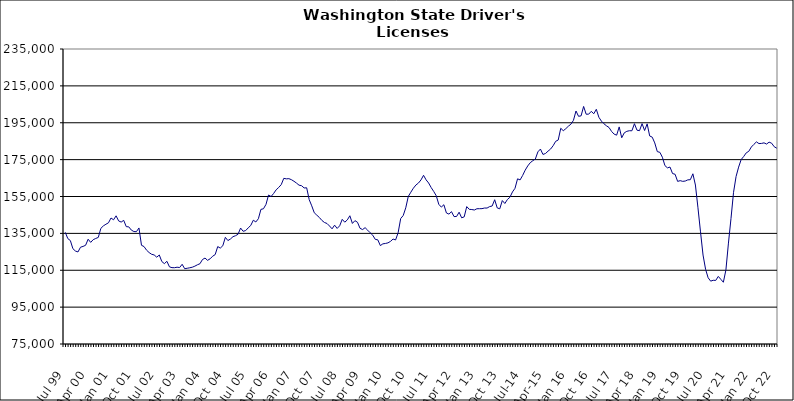
| Category | Series 0 |
|---|---|
| Jul 99 | 135560 |
| Aug 99 | 132182 |
| Sep 99 | 131104 |
| Oct 99 | 126694 |
| Nov 99 | 125425 |
| Dec 99 | 124927 |
| Jan 00 | 127499 |
| Feb 00 | 127927 |
| Mar 00 | 128547 |
| Apr 00 | 131834 |
| May 00 | 130120 |
| Jun 00 | 131595 |
| Jul 00 | 132236 |
| Aug 00 | 132819 |
| Sep 00 | 137711 |
| Oct 00 | 139063 |
| Nov 00 | 139952 |
| Dec 00 | 140732 |
| Jan 01 | 143338 |
| Feb 01 | 142359 |
| Mar 01 | 144523 |
| Apr 01 | 141758 |
| May 01 | 141135 |
| Jun 01 | 142064 |
| Jul 01 | 138646 |
| Aug 01 | 138530 |
| Sep 01 | 136784 |
| Oct 01 | 135996 |
| Nov 01 | 135917 |
| Dec 01 | 137940 |
| Jan 02 | 128531 |
| Feb 02 | 127848 |
| Mar 02 | 125876 |
| Apr 02 | 124595 |
| May 02 | 123660 |
| Jun 02 | 123282 |
| Jul 02 | 122089 |
| Aug 02 | 123279 |
| Sep 02 | 119727 |
| Oct 02 | 118588 |
| Nov 02 | 119854 |
| Dec 02 | 116851 |
| Jan 03 | 116407 |
| Feb 03 | 116382 |
| Mar 03 | 116648 |
| Apr 03 | 116471 |
| May 03 | 118231 |
| Jun 03 | 115831 |
| Jul 03 | 116082 |
| Aug 03 | 116341 |
| Sep 03 | 116653 |
| Oct 03 | 117212 |
| Nov 03 | 117962 |
| Dec 03 | 118542 |
| Jan 04 | 120817 |
| Feb 04 | 121617 |
| Mar 04 | 120369 |
| Apr 04 | 121200 |
| May 04 | 122609 |
| Jun 04 | 123484 |
| Jul 04 | 127844 |
| Aug 04 | 127025 |
| Sep 04 | 128273 |
| Oct 04 | 132853 |
| Nov 04 | 131106 |
| Dec 04 | 131935 |
| Jan 05 | 133205 |
| Feb 05 | 133736 |
| Mar 05 | 134528 |
| Apr 05 | 137889 |
| May 05 | 136130 |
| Jun 05 | 136523 |
| Jul 05 | 137997 |
| Aug 05 | 139294 |
| Sep 05 | 142140 |
| Oct 05 | 141192 |
| Nov 05 | 142937 |
| Dec 05 | 148013 |
| Jan 06 | 148341 |
| Feb 06 | 150744 |
| Mar 06 | 155794 |
| Apr 06 | 154984 |
| May 06 | 156651 |
| Jun 06 | 158638 |
| Jul 06 | 159911 |
| Aug 06 | 161445 |
| Sep 06 | 164852 |
| Oct 06 | 164570 |
| Nov 06 | 164679 |
| Dec 06 | 164127 |
| Jan 07 | 163271 |
| Feb 07 | 162273 |
| Mar 07 | 161140 |
| Apr 07 | 160860 |
| May 07 | 159633 |
| Jun 07 | 159724 |
| Jul 07 | 153303 |
| Aug 07 | 149939 |
| Sep 07 | 146172 |
| Oct 07 | 144876 |
| Nov 07 | 143613 |
| Dec 07 | 142022 |
| Jan 08 | 140909 |
| Feb 08 | 140368 |
| Mar 08 | 138998 |
| Apr 08 | 137471 |
| May 08 | 139453 |
| Jun 08 | 137680 |
| Jul 08 | 139120 |
| Aug 08 | 142612 |
| Sep-08 | 141071 |
| Oct 08 | 142313 |
| Nov 08 | 144556 |
| Dec 08 | 140394 |
| Jan 09 | 141903 |
| Feb 09 | 141036 |
| Mar 09 | 137751 |
| Apr 09 | 137060 |
| May 09 | 138101 |
| Jun 09 | 136739 |
| Jul 09 | 135317 |
| Aug 09 | 134020 |
| Sep 09 | 131756 |
| Oct 09 | 131488 |
| Nov 09 | 128370 |
| Dec 09 | 129323 |
| Jan 10 | 129531 |
| Feb 10 | 129848 |
| Mar 10 | 130654 |
| Apr 10 | 131929 |
| May 10 | 131429 |
| Jun 10 | 135357 |
| Jul 10 | 143032 |
| Aug 10 | 144686 |
| Sep 10 | 148856 |
| Oct 10 | 155042 |
| Nov 10 | 157328 |
| Dec 10 | 159501 |
| Jan 11 | 161221 |
| Feb 11 | 162312 |
| Mar 11 | 163996 |
| Apr 11 | 166495 |
| May 11 | 164040 |
| Jun 11 | 162324 |
| Jul 11 | 159862 |
| Aug 11 | 157738 |
| Sep 11 | 155430 |
| Oct 11 | 150762 |
| Nov 11 | 149255 |
| Dec 11 | 150533 |
| Jan 12 | 146068 |
| Feb 12 | 145446 |
| Mar 12 | 146788 |
| Apr 12 | 144110 |
| May 12 | 144162 |
| Jun 12 | 146482 |
| Jul 12 | 143445 |
| Aug 12 | 143950 |
| Sep 12 | 149520 |
| Oct 12 | 148033 |
| Nov 12 | 147926 |
| Dec 12 | 147674 |
| Jan 13 | 148360 |
| Feb-13 | 148388 |
| Mar-13 | 148414 |
| Apr 13 | 148749 |
| May 13 | 148735 |
| Jun-13 | 149521 |
| Jul 13 | 149837 |
| Aug 13 | 153252 |
| Sep 13 | 148803 |
| Oct 13 | 148315 |
| Nov 13 | 152804 |
| Dec 13 | 151209 |
| Jan 14 | 153357 |
| Feb-14 | 154608 |
| Mar 14 | 157479 |
| Apr 14 | 159441 |
| May 14 | 164591 |
| Jun 14 | 163995 |
| Jul-14 | 166411 |
| Aug-14 | 169272 |
| Sep 14 | 171565 |
| Oct 14 | 173335 |
| Nov 14 | 174406 |
| Dec 14 | 175302 |
| Jan 15 | 179204 |
| Feb 15 | 180737 |
| Mar 15 | 177810 |
| Apr-15 | 178331 |
| May 15 | 179601 |
| Jun-15 | 180729 |
| Jul 15 | 182540 |
| Aug 15 | 184924 |
| Sep 15 | 185620 |
| Oct 15 | 192002 |
| Nov 15 | 190681 |
| Dec 15 | 191795 |
| Jan 16 | 193132 |
| Feb 16 | 194206 |
| Mar 16 | 196319 |
| Apr 16 | 201373 |
| May 16 | 198500 |
| Jun 16 | 198743 |
| Jul 16 | 203841 |
| Aug 16 | 199630 |
| Sep 16 | 199655 |
| Oct 16 | 201181 |
| Nov 16 | 199888 |
| Dec 16 | 202304 |
| Jan 17 | 197977 |
| Feb 17 | 195889 |
| Mar 17 | 194438 |
| Apr 17 | 193335 |
| May 17 | 192430 |
| Jun 17 | 190298 |
| Jul 17 | 188832 |
| Aug 17 | 188264 |
| Sep 17 | 192738 |
| Oct 17 | 186856 |
| Nov 17 | 189537 |
| Dec 17 | 190341 |
| Jan 18 | 190670 |
| Feb 18 | 190645 |
| Mar 18 | 194476 |
| Apr 18 | 190971 |
| May 18 | 190707 |
| Jun 18 | 194516 |
| Jul 18 | 190783 |
| Aug 18 | 194390 |
| Sep 18 | 187831 |
| Oct 18 | 187188 |
| Nov 18 | 184054 |
| Dec 18 | 179347 |
| Jan 19 | 178958 |
| Feb 19 | 176289 |
| Mar 19 | 171747 |
| Apr 19 | 170532 |
| May 19 | 170967 |
| Jun 19 | 167444 |
| Jul 19 | 167059 |
| Aug 19 | 163194 |
| Sep 19 | 163599 |
| Oct 19 | 163212 |
| Nov 19 | 163388 |
| Dec 19 | 164024 |
| Jan 20 | 164114 |
| Feb 20 | 167320 |
| Mar 20 | 161221 |
| Apr 20 | 148866 |
| May 20 | 135821 |
| Jun 20 | 123252 |
| Jul 20 | 115526 |
| Aug 20 | 110940 |
| Sep 20 | 109099 |
| Oct 20 | 109566 |
| Nov 20 | 109488 |
| Dec 20 | 111658 |
| Jan 21 | 110070 |
| Feb 21 | 108491 |
| Mar 21 | 115176 |
| Apr 21 | 129726 |
| May 21 | 143052 |
| Jun 21 | 157253 |
| Jul 21 | 165832 |
| Aug 21 | 170937 |
| Sep 21 | 175042 |
| Oct 21 | 176696 |
| Nov 21 | 178677 |
| Dec 21 | 179501 |
| Jan 22 | 181825 |
| Feb 22 | 183258 |
| Mar 22 | 184618 |
| Apr 22 | 183710 |
| May 22 | 183784 |
| Jun 22 | 184101 |
| Jul 22 | 183443 |
| Aug 22 | 184475 |
| Sep 22 | 183902 |
| Oct 22 | 181994 |
| Nov 22 | 181207 |